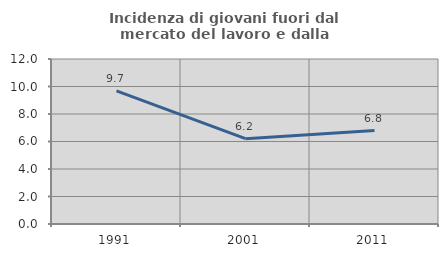
| Category | Incidenza di giovani fuori dal mercato del lavoro e dalla formazione  |
|---|---|
| 1991.0 | 9.677 |
| 2001.0 | 6.206 |
| 2011.0 | 6.792 |